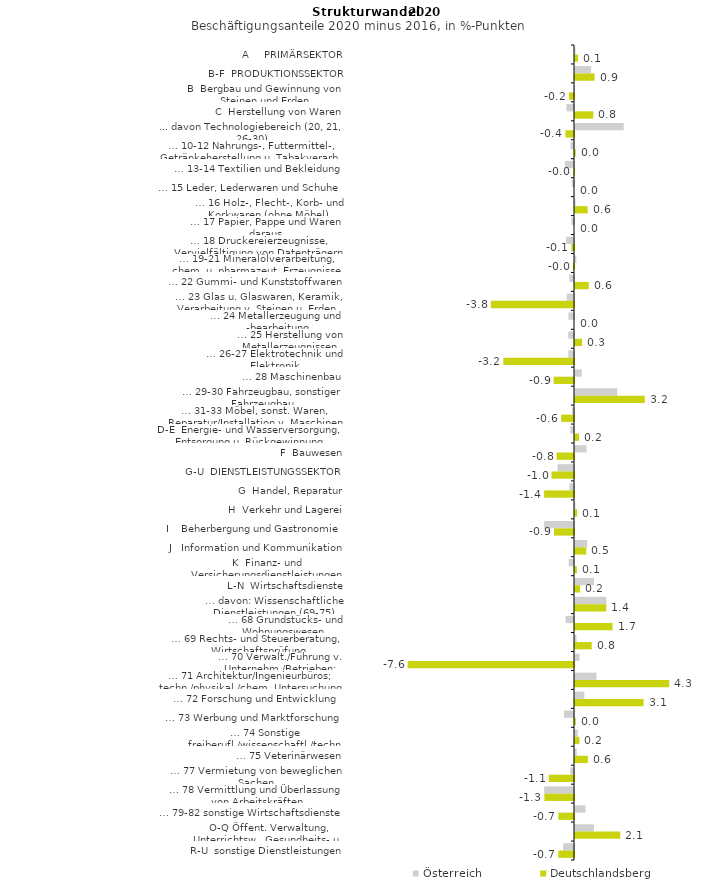
| Category | Österreich | Deutschlandsberg |
|---|---|---|
| A     PRIMÄRSEKTOR | 0.018 | 0.141 |
| B-F  PRODUKTIONSSEKTOR | 0.731 | 0.89 |
| B  Bergbau und Gewinnung von Steinen und Erden | -0.006 | -0.225 |
| C  Herstellung von Waren | -0.347 | 0.836 |
| ... davon Technologiebereich (20, 21, 26-30) | 2.213 | -0.39 |
| … 10-12 Nahrungs-, Futtermittel-, Getränkeherstellung u. Tabakverarb. | -0.156 | 0.035 |
| … 13-14 Textilien und Bekleidung | -0.417 | -0.024 |
| … 15 Leder, Lederwaren und Schuhe | -0.095 | 0 |
| … 16 Holz-, Flecht-, Korb- und Korkwaren (ohne Möbel)  | 0.023 | 0.575 |
| … 17 Papier, Pappe und Waren daraus  | -0.11 | 0 |
| … 18 Druckereierzeugnisse, Vervielfältigung von Datenträgern | -0.357 | -0.119 |
| … 19-21 Mineralölverarbeitung, chem. u. pharmazeut. Erzeugnisse | 0.063 | -0.05 |
| … 22 Gummi- und Kunststoffwaren | -0.217 | 0.625 |
| … 23 Glas u. Glaswaren, Keramik, Verarbeitung v. Steinen u. Erden  | -0.33 | -3.781 |
| … 24 Metallerzeugung und -bearbeitung | -0.251 | 0 |
| … 25 Herstellung von Metallerzeugnissen  | -0.261 | 0.324 |
| … 26-27 Elektrotechnik und Elektronik | -0.258 | -3.211 |
| … 28 Maschinenbau | 0.309 | -0.926 |
| … 29-30 Fahrzeugbau, sonstiger Fahrzeugbau | 1.924 | 3.172 |
| … 31-33 Möbel, sonst. Waren, Reparatur/Installation v. Maschinen | -0.089 | -0.585 |
| D-E  Energie- und Wasserversorgung, Entsorgung u. Rückgewinnung | -0.17 | 0.184 |
| F  Bauwesen | 0.522 | -0.795 |
| G-U  DIENSTLEISTUNGSSEKTOR | -0.749 | -1.02 |
| G  Handel, Reparatur | -0.208 | -1.357 |
| H  Verkehr und Lagerei | 0.02 | 0.099 |
| I    Beherbergung und Gastronomie | -1.357 | -0.91 |
| J   Information und Kommunikation | 0.559 | 0.513 |
| K  Finanz- und Versicherungsdienstleistungen | -0.241 | 0.082 |
| L-N  Wirtschaftsdienste | 0.862 | 0.234 |
| … davon: Wissenschaftliche Dienstleistungen (69-75) | 1.424 | 1.419 |
| … 68 Grundstücks- und Wohnungswesen  | -0.382 | 1.705 |
| … 69 Rechts- und Steuerberatung, Wirtschaftsprüfung | 0.071 | 0.762 |
| … 70 Verwalt./Führung v. Unternehm./Betrieben; Unternehmensberat. | 0.205 | -7.563 |
| … 71 Architektur/Ingenieurbüros; techn./physikal./chem. Untersuchung | 0.976 | 4.28 |
| … 72 Forschung und Entwicklung  | 0.423 | 3.117 |
| … 73 Werbung und Marktforschung | -0.459 | 0.039 |
| … 74 Sonstige freiberufl./wissenschaftl./techn. Tätigkeiten | 0.13 | 0.2 |
| … 75 Veterinärwesen | 0.078 | 0.584 |
| … 77 Vermietung von beweglichen Sachen  | -0.163 | -1.147 |
| … 78 Vermittlung und Überlassung von Arbeitskräften | -1.357 | -1.347 |
| … 79-82 sonstige Wirtschaftsdienste | 0.479 | -0.711 |
| O-Q Öffent. Verwaltung, Unterrichtsw., Gesundheits- u. Sozialwesen | 0.859 | 2.055 |
| R-U  sonstige Dienstleistungen | -0.495 | -0.714 |